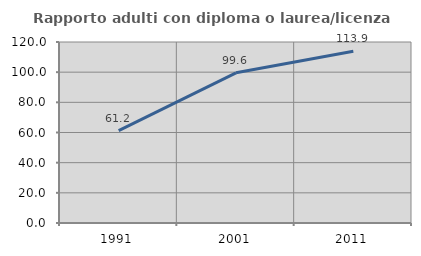
| Category | Rapporto adulti con diploma o laurea/licenza media  |
|---|---|
| 1991.0 | 61.194 |
| 2001.0 | 99.581 |
| 2011.0 | 113.867 |